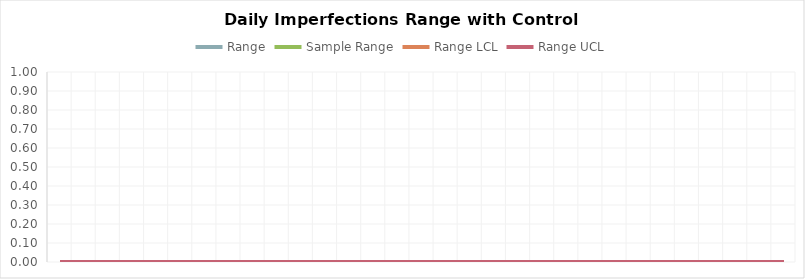
| Category | Range | Sample Range | Range LCL | Range UCL |
|---|---|---|---|---|
| 0 | 0 | 0 | 0 | 0 |
| 1 | 0 | 0 | 0 | 0 |
| 2 | 0 | 0 | 0 | 0 |
| 3 | 0 | 0 | 0 | 0 |
| 4 | 0 | 0 | 0 | 0 |
| 5 | 0 | 0 | 0 | 0 |
| 6 | 0 | 0 | 0 | 0 |
| 7 | 0 | 0 | 0 | 0 |
| 8 | 0 | 0 | 0 | 0 |
| 9 | 0 | 0 | 0 | 0 |
| 10 | 0 | 0 | 0 | 0 |
| 11 | 0 | 0 | 0 | 0 |
| 12 | 0 | 0 | 0 | 0 |
| 13 | 0 | 0 | 0 | 0 |
| 14 | 0 | 0 | 0 | 0 |
| 15 | 0 | 0 | 0 | 0 |
| 16 | 0 | 0 | 0 | 0 |
| 17 | 0 | 0 | 0 | 0 |
| 18 | 0 | 0 | 0 | 0 |
| 19 | 0 | 0 | 0 | 0 |
| 20 | 0 | 0 | 0 | 0 |
| 21 | 0 | 0 | 0 | 0 |
| 22 | 0 | 0 | 0 | 0 |
| 23 | 0 | 0 | 0 | 0 |
| 24 | 0 | 0 | 0 | 0 |
| 25 | 0 | 0 | 0 | 0 |
| 26 | 0 | 0 | 0 | 0 |
| 27 | 0 | 0 | 0 | 0 |
| 28 | 0 | 0 | 0 | 0 |
| 29 | 0 | 0 | 0 | 0 |
| 30 | 0 | 0 | 0 | 0 |